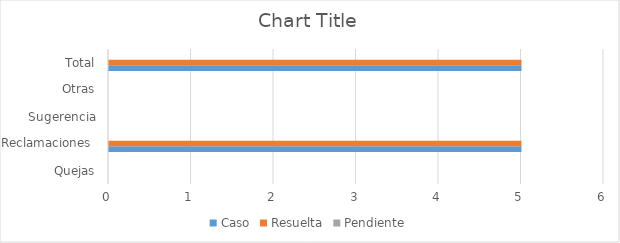
| Category | Caso | Resuelta | Pendiente |
|---|---|---|---|
| Quejas | 0 | 0 | 0 |
| Reclamaciones  | 5 | 5 | 0 |
| Sugerencia | 0 | 0 | 0 |
| Otras | 0 | 0 | 0 |
| Total | 5 | 5 | 0 |